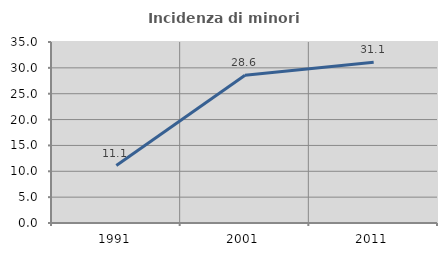
| Category | Incidenza di minori stranieri |
|---|---|
| 1991.0 | 11.111 |
| 2001.0 | 28.571 |
| 2011.0 | 31.067 |